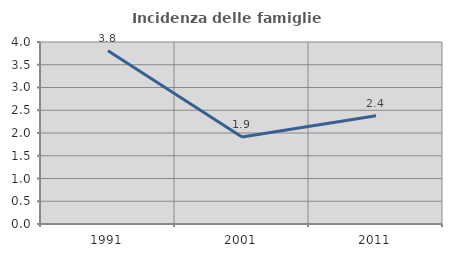
| Category | Incidenza delle famiglie numerose |
|---|---|
| 1991.0 | 3.808 |
| 2001.0 | 1.914 |
| 2011.0 | 2.381 |